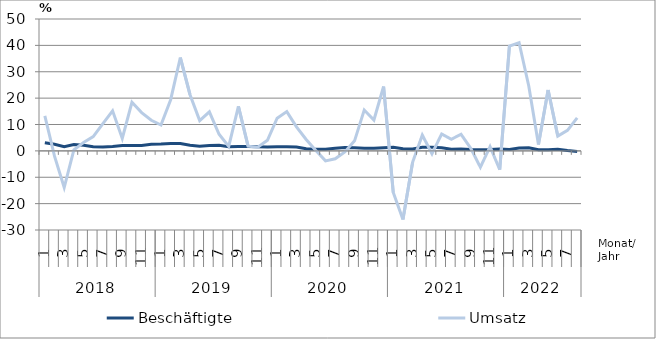
| Category | Beschäftigte | Umsatz |
|---|---|---|
| 0 | 3.1 | 13.3 |
| 1 | 2.5 | -2 |
| 2 | 1.6 | -13.9 |
| 3 | 2.4 | 0.4 |
| 4 | 2.1 | 3.2 |
| 5 | 1.6 | 5.4 |
| 6 | 1.5 | 10.3 |
| 7 | 1.7 | 15.2 |
| 8 | 2 | 4.7 |
| 9 | 2 | 18.4 |
| 10 | 2 | 14.5 |
| 11 | 2.5 | 11.6 |
| 12 | 2.6 | 9.8 |
| 13 | 2.8 | 19.4 |
| 14 | 2.8 | 35.4 |
| 15 | 2.1 | 21.3 |
| 16 | 1.8 | 11.5 |
| 17 | 2 | 14.8 |
| 18 | 2.1 | 6.3 |
| 19 | 1.6 | 1.7 |
| 20 | 1.7 | 16.9 |
| 21 | 1.7 | 1.8 |
| 22 | 1.6 | 1.4 |
| 23 | 1.5 | 4 |
| 24 | 1.6 | 12.4 |
| 25 | 1.6 | 14.9 |
| 26 | 1.5 | 9.1 |
| 27 | 0.8 | 4.3 |
| 28 | 0.6 | 0.1 |
| 29 | 0.6 | -3.8 |
| 30 | 1 | -3 |
| 31 | 1.3 | -0.4 |
| 32 | 1.2 | 3.8 |
| 33 | 1 | 15.5 |
| 34 | 1 | 11.7 |
| 35 | 1.2 | 24.4 |
| 36 | 1.4 | -15.8 |
| 37 | 0.8 | -26 |
| 38 | 0.7 | -4.3 |
| 39 | 1.4 | 6 |
| 40 | 1.4 | -1.1 |
| 41 | 1.2 | 6.4 |
| 42 | 0.6 | 4.4 |
| 43 | 0.7 | 6.3 |
| 44 | 0.5 | 1 |
| 45 | 0.4 | -6.2 |
| 46 | 0.5 | 1.6 |
| 47 | 0.7 | -7.1 |
| 48 | 0.5 | 39.7 |
| 49 | 1.1 | 41 |
| 50 | 1.2 | 24.6 |
| 51 | 0.4 | 2.4 |
| 52 | 0.4 | 23.1 |
| 53 | 0.6 | 5.6 |
| 54 | 0.1 | 7.8 |
| 55 | -0.2 | 12.5 |